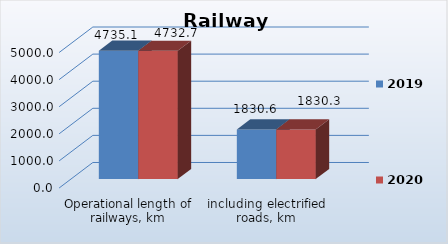
| Category | 2019 | 2020 |
|---|---|---|
| Operational length of railways, km | 4735.1 | 4732.7 |
| including electrified roads, km | 1830.6 | 1830.3 |